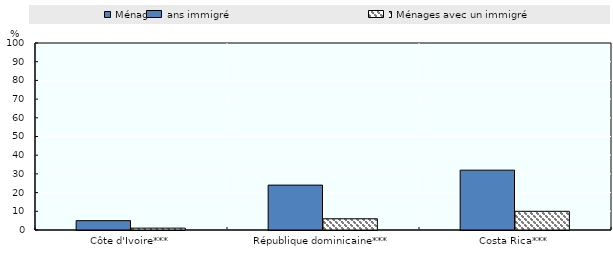
| Category | Ménages sans immigré | Ménages avec un immigré |
|---|---|---|
| Côte d'Ivoire*** | 5 | 1 |
| République dominicaine*** | 24 | 6 |
| Costa Rica*** | 32 | 10 |